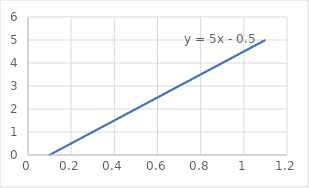
| Category | Series 0 |
|---|---|
| 0.1 | 0 |
| 1.1 | 5 |